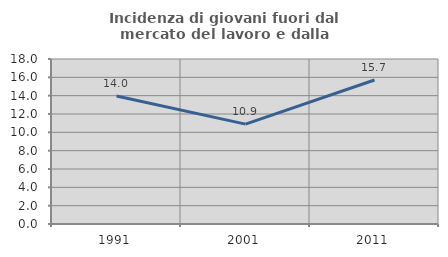
| Category | Incidenza di giovani fuori dal mercato del lavoro e dalla formazione  |
|---|---|
| 1991.0 | 13.966 |
| 2001.0 | 10.895 |
| 2011.0 | 15.707 |